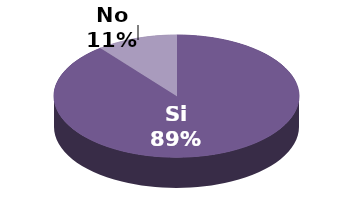
| Category | Series 1 |
|---|---|
| Si | 42 |
| No | 5 |